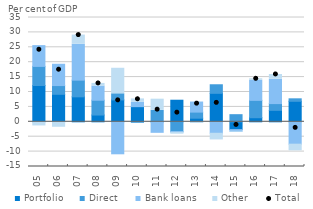
| Category | Portfolio | Direct | Bank loans | Other |
|---|---|---|---|---|
| 2005-12-01 | 12.18 | 6.41 | 6.97 | -1.39 |
| 2006-12-01 | 9.23 | 2.93 | 7.15 | -1.83 |
| 2007-12-01 | 8.38 | 5.6 | 12.07 | 3.05 |
| 2008-12-01 | 2.27 | 4.97 | 4.76 | 0.88 |
| 2009-12-01 | 7.34 | 2.06 | -10.74 | 8.56 |
| 2010-12-01 | 5.08 | -0.13 | 1.45 | 1.16 |
| 2011-12-01 | 0.01 | 3.82 | -3.53 | 3.76 |
| 2012-12-01 | 7.24 | -3.3 | -0.21 | -0.65 |
| 2013-12-01 | 1.21 | 2.04 | 3.38 | -0.55 |
| 2014-12-01 | 9.56 | 2.87 | -3.85 | -2.23 |
| 2015-12-01 | -2.62 | 2.39 | -0.57 | -0.25 |
| 2016-12-01 | 1.37 | 5.82 | 6.72 | 0.52 |
| 2017-12-01 | 3.85 | 2.26 | 8.16 | 1.61 |
| 2018-12-01 | 6.88 | 0.83 | -7.51 | -2.22 |